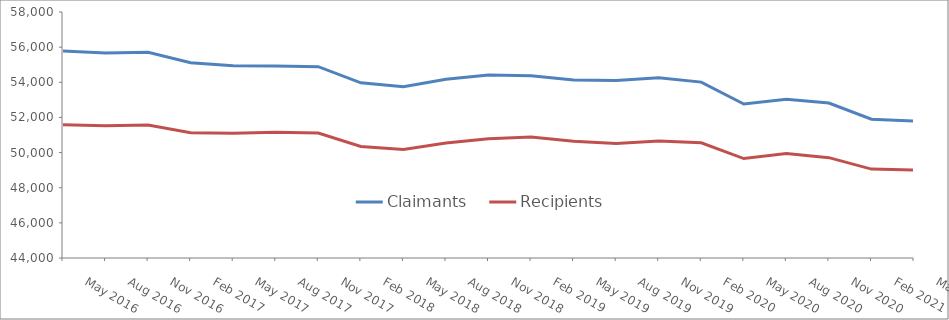
| Category | Claimants | Recipients |
|---|---|---|
| May 2016 | 55780 | 51580 |
| Aug 2016 | 55660 | 51520 |
| Nov 2016 | 55710 | 51570 |
| Feb 2017 | 55110 | 51130 |
| May 2017 | 54940 | 51100 |
| Aug 2017 | 54930 | 51160 |
| Nov 2017 | 54890 | 51110 |
| Feb 2018 | 53970 | 50350 |
| May 2018 | 53750 | 50170 |
| Aug 2018 | 54170 | 50540 |
| Nov 2018 | 54410 | 50790 |
| Feb 2019 | 54370 | 50880 |
| May 2019 | 54130 | 50650 |
| Aug 2019 | 54100 | 50520 |
| Nov 2019 | 54260 | 50660 |
| Feb 2020 | 54010 | 50560 |
| May 2020 | 52760 | 49660 |
| Aug 2020 | 53040 | 49940 |
| Nov 2020 | 52820 | 49710 |
| Feb 2021 | 51900 | 49060 |
| May 2021 | 51790 | 49000 |